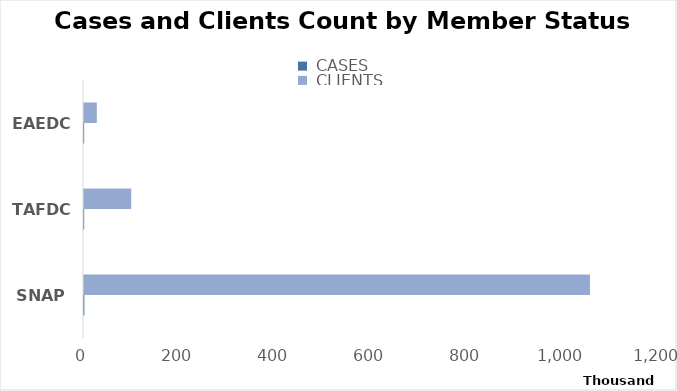
| Category |  CASES |  CLIENTS |
|---|---|---|
| SNAP | 760 | 1054110 |
| TAFDC | 339 | 98406 |
| EAEDC | 320 | 26711 |